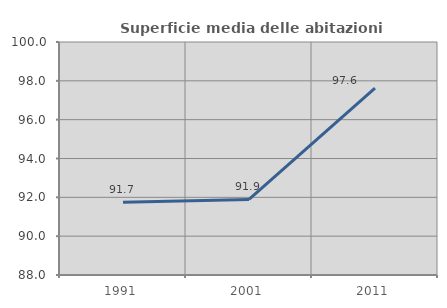
| Category | Superficie media delle abitazioni occupate |
|---|---|
| 1991.0 | 91.748 |
| 2001.0 | 91.889 |
| 2011.0 | 97.628 |